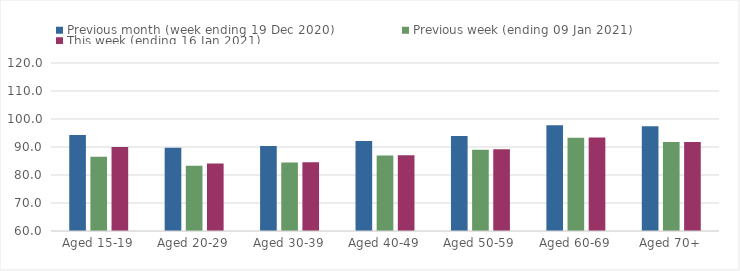
| Category | Previous month (week ending 19 Dec 2020) | Previous week (ending 09 Jan 2021) | This week (ending 16 Jan 2021) |
|---|---|---|---|
| Aged 15-19 | 94.26 | 86.56 | 90.03 |
| Aged 20-29 | 89.75 | 83.27 | 84.11 |
| Aged 30-39 | 90.35 | 84.49 | 84.59 |
| Aged 40-49 | 92.13 | 86.93 | 87.09 |
| Aged 50-59 | 93.94 | 89.05 | 89.23 |
| Aged 60-69 | 97.81 | 93.32 | 93.35 |
| Aged 70+ | 97.43 | 91.83 | 91.83 |